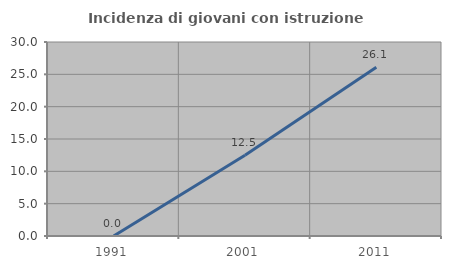
| Category | Incidenza di giovani con istruzione universitaria |
|---|---|
| 1991.0 | 0 |
| 2001.0 | 12.5 |
| 2011.0 | 26.087 |